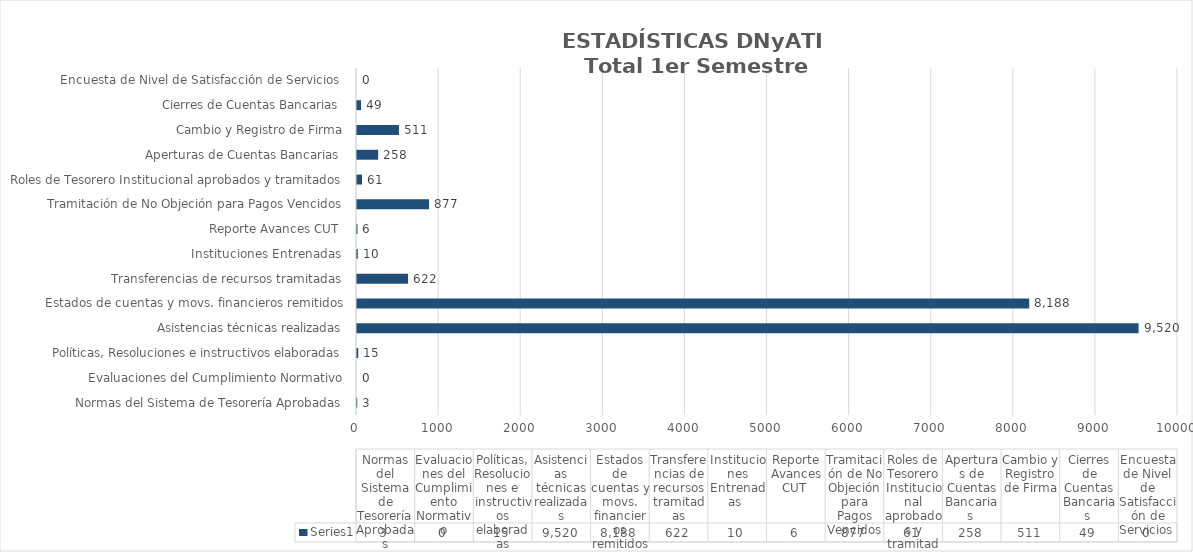
| Category | Series 0 |
|---|---|
| Normas del Sistema de Tesorería Aprobadas | 3 |
| Evaluaciones del Cumplimiento Normativo | 0 |
| Políticas, Resoluciones e instructivos elaboradas | 15 |
| Asistencias técnicas realizadas | 9520 |
| Estados de cuentas y movs. financieros remitidos | 8188 |
| Transferencias de recursos tramitadas | 622 |
| Instituciones Entrenadas  | 10 |
| Reporte Avances CUT  | 6 |
| Tramitación de No Objeción para Pagos Vencidos | 877 |
| Roles de Tesorero Institucional aprobados y tramitados | 61 |
| Aperturas de Cuentas Bancarias  | 258 |
| Cambio y Registro de Firma | 511 |
| Cierres de Cuentas Bancarias  | 49 |
| Encuesta de Nivel de Satisfacción de Servicios  | 0 |